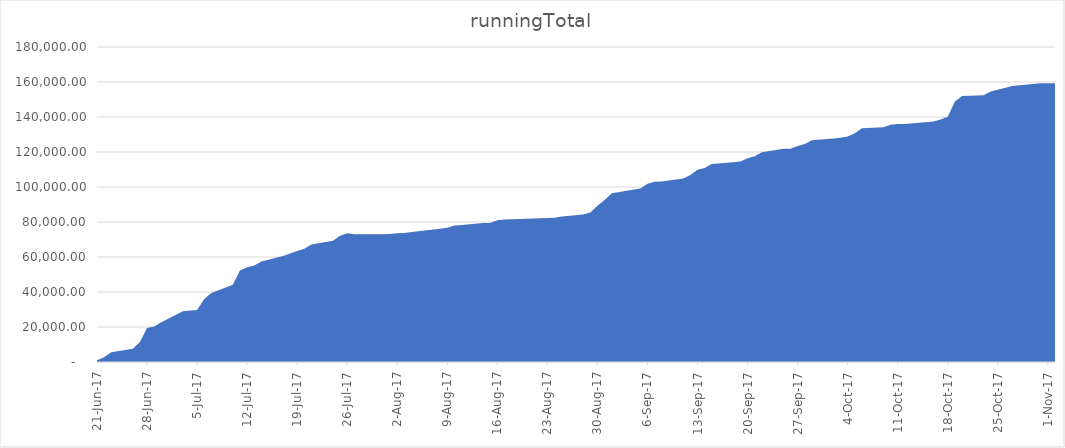
| Category |  runningTotal  |
|---|---|
| 2017-11-02 | 159340.726 |
| 2017-10-31 | 159308.227 |
| 2017-10-27 | 157664.013 |
| 2017-10-25 | 155635.848 |
| 2017-10-24 | 154528.834 |
| 2017-10-23 | 152442.469 |
| 2017-10-20 | 152006.215 |
| 2017-10-19 | 148876.554 |
| 2017-10-18 | 140101.707 |
| 2017-10-17 | 138595.457 |
| 2017-10-16 | 137434.693 |
| 2017-10-12 | 136028.594 |
| 2017-10-11 | 136023.979 |
| 2017-10-10 | 135546.416 |
| 2017-10-09 | 134180.868 |
| 2017-10-06 | 133507.768 |
| 2017-10-05 | 130782.969 |
| 2017-10-04 | 128786.877 |
| 2017-10-03 | 128213.847 |
| 2017-10-02 | 127665.77 |
| 2017-09-29 | 126660.935 |
| 2017-09-28 | 124631.181 |
| 2017-09-27 | 123496.452 |
| 2017-09-26 | 121900.532 |
| 2017-09-25 | 121894.855 |
| 2017-09-22 | 119914.011 |
| 2017-09-21 | 117641.846 |
| 2017-09-20 | 116451.494 |
| 2017-09-19 | 114529.51 |
| 2017-09-18 | 114083.725 |
| 2017-09-15 | 113086.765 |
| 2017-09-14 | 110917.833 |
| 2017-09-13 | 109885.709 |
| 2017-09-12 | 106874.859 |
| 2017-09-11 | 104856.186 |
| 2017-09-08 | 103125.57 |
| 2017-09-07 | 103036.794 |
| 2017-09-06 | 101798.233 |
| 2017-09-05 | 99185.825 |
| 2017-09-01 | 96498.941 |
| 2017-08-31 | 92581.118 |
| 2017-08-30 | 89309.531 |
| 2017-08-29 | 85398.623 |
| 2017-08-28 | 84313.969 |
| 2017-08-25 | 83084.899 |
| 2017-08-24 | 82387.951 |
| 2017-08-17 | 81382.565 |
| 2017-08-16 | 81000.242 |
| 2017-08-15 | 79468.465 |
| 2017-08-14 | 79448.942 |
| 2017-08-11 | 78282.889 |
| 2017-08-10 | 77964.275 |
| 2017-08-09 | 76686.363 |
| 2017-08-08 | 76201.993 |
| 2017-08-04 | 74335.073 |
| 2017-08-03 | 73653.949 |
| 2017-08-02 | 73517.264 |
| 2017-08-01 | 73072.291 |
| 2017-07-31 | 73020.754 |
| 2017-07-27 | 72946.602 |
| 2017-07-26 | 73636.918 |
| 2017-07-25 | 72136.406 |
| 2017-07-24 | 69321.617 |
| 2017-07-21 | 67138.928 |
| 2017-07-20 | 64688.675 |
| 2017-07-19 | 63471.569 |
| 2017-07-18 | 61989.974 |
| 2017-07-17 | 60504.764 |
| 2017-07-14 | 57378.956 |
| 2017-07-13 | 55177.414 |
| 2017-07-12 | 54089.692 |
| 2017-07-11 | 52348.151 |
| 2017-07-10 | 44150.531 |
| 2017-07-07 | 39369.966 |
| 2017-07-06 | 36013.61 |
| 2017-07-05 | 29719.835 |
| 2017-07-03 | 28999.644 |
| 2017-06-30 | 22758.902 |
| 2017-06-29 | 20318.06 |
| 2017-06-28 | 19379.659 |
| 2017-06-27 | 11498.903 |
| 2017-06-26 | 7562.601 |
| 2017-06-23 | 5505.24 |
| 2017-06-22 | 2651.31 |
| 2017-06-21 | 1032.736 |